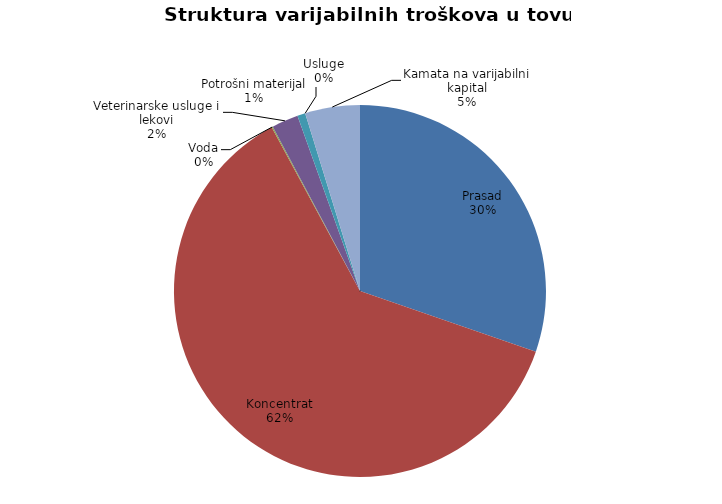
| Category | Series 0 |
|---|---|
| Prasad | 6612.245 |
| Koncentrat | 13501.378 |
| Voda | 22.73 |
| Veterinarske usluge i lekovi | 505.102 |
| Potrošni materijal | 151.531 |
| Usluge | 0 |
| Kamata na varijabilni kapital | 1039.649 |